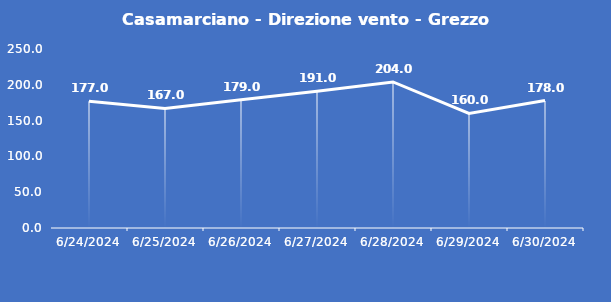
| Category | Casamarciano - Direzione vento - Grezzo (°N) |
|---|---|
| 6/24/24 | 177 |
| 6/25/24 | 167 |
| 6/26/24 | 179 |
| 6/27/24 | 191 |
| 6/28/24 | 204 |
| 6/29/24 | 160 |
| 6/30/24 | 178 |